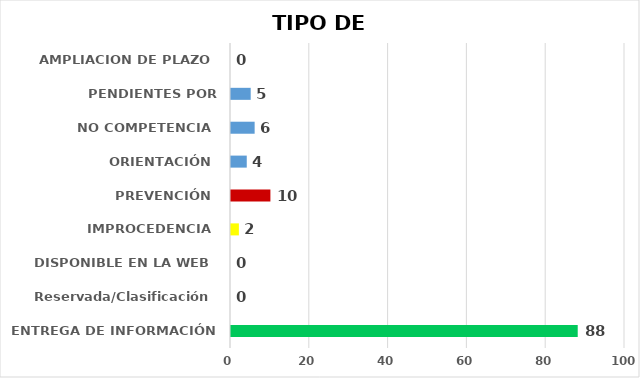
| Category | CANTIDAD DE RESPUESTAS |
|---|---|
| ENTREGA DE INFORMACIÓN | 88 |
| Reservada/Clasificación | 0 |
| DISPONIBLE EN LA WEB | 0 |
| IMPROCEDENCIA | 2 |
| PREVENCIÓN | 10 |
| ORIENTACIÓN | 4 |
| NO COMPETENCIA | 6 |
| PENDIENTES POR CONTESTAR | 5 |
| AMPLIACION DE PLAZO | 0 |